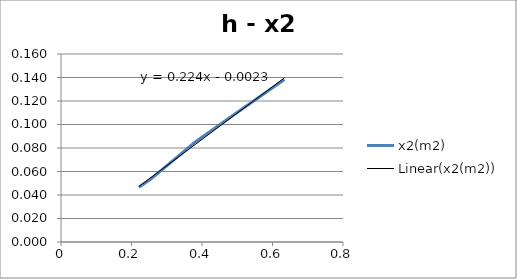
| Category | x2(m2) |
|---|---|
| 0.221 | 0.047 |
| 0.254 | 0.053 |
| 0.379 | 0.085 |
| 0.471 | 0.104 |
| 0.634 | 0.138 |